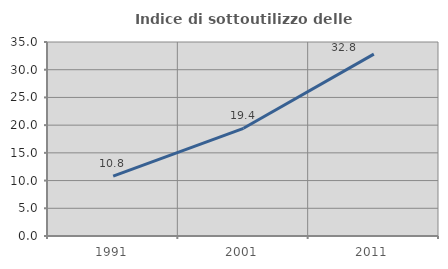
| Category | Indice di sottoutilizzo delle abitazioni  |
|---|---|
| 1991.0 | 10.802 |
| 2001.0 | 19.427 |
| 2011.0 | 32.817 |